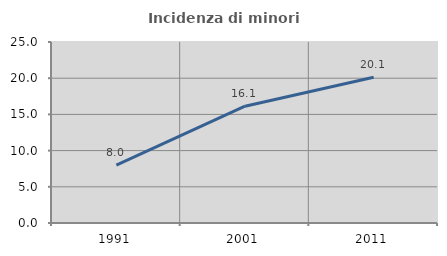
| Category | Incidenza di minori stranieri |
|---|---|
| 1991.0 | 8 |
| 2001.0 | 16.129 |
| 2011.0 | 20.134 |